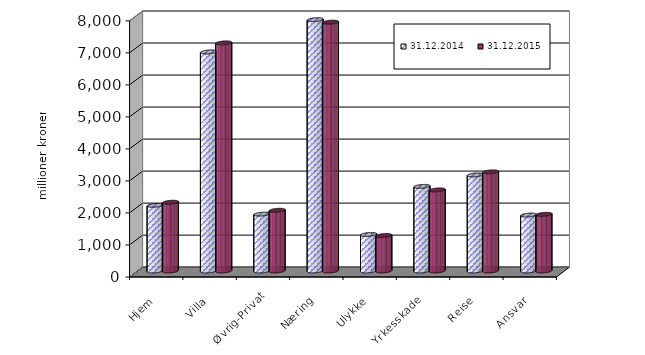
| Category | 31.12.2014 | 31.12.2015 |
|---|---|---|
| Hjem | 2050.098 | 2147.501 |
| Villa | 6842.592 | 7124.38 |
| Øvrig-Privat | 1776.053 | 1895.971 |
| Næring | 7850.181 | 7771.738 |
| Ulykke | 1141.154 | 1106.919 |
| Yrkesskade | 2643.795 | 2532.747 |
| Reise | 2999.816 | 3095.825 |
| Ansvar | 1747.777 | 1769.838 |